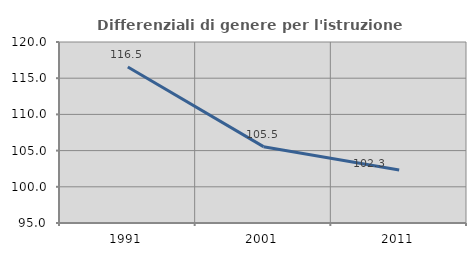
| Category | Differenziali di genere per l'istruzione superiore |
|---|---|
| 1991.0 | 116.546 |
| 2001.0 | 105.545 |
| 2011.0 | 102.314 |